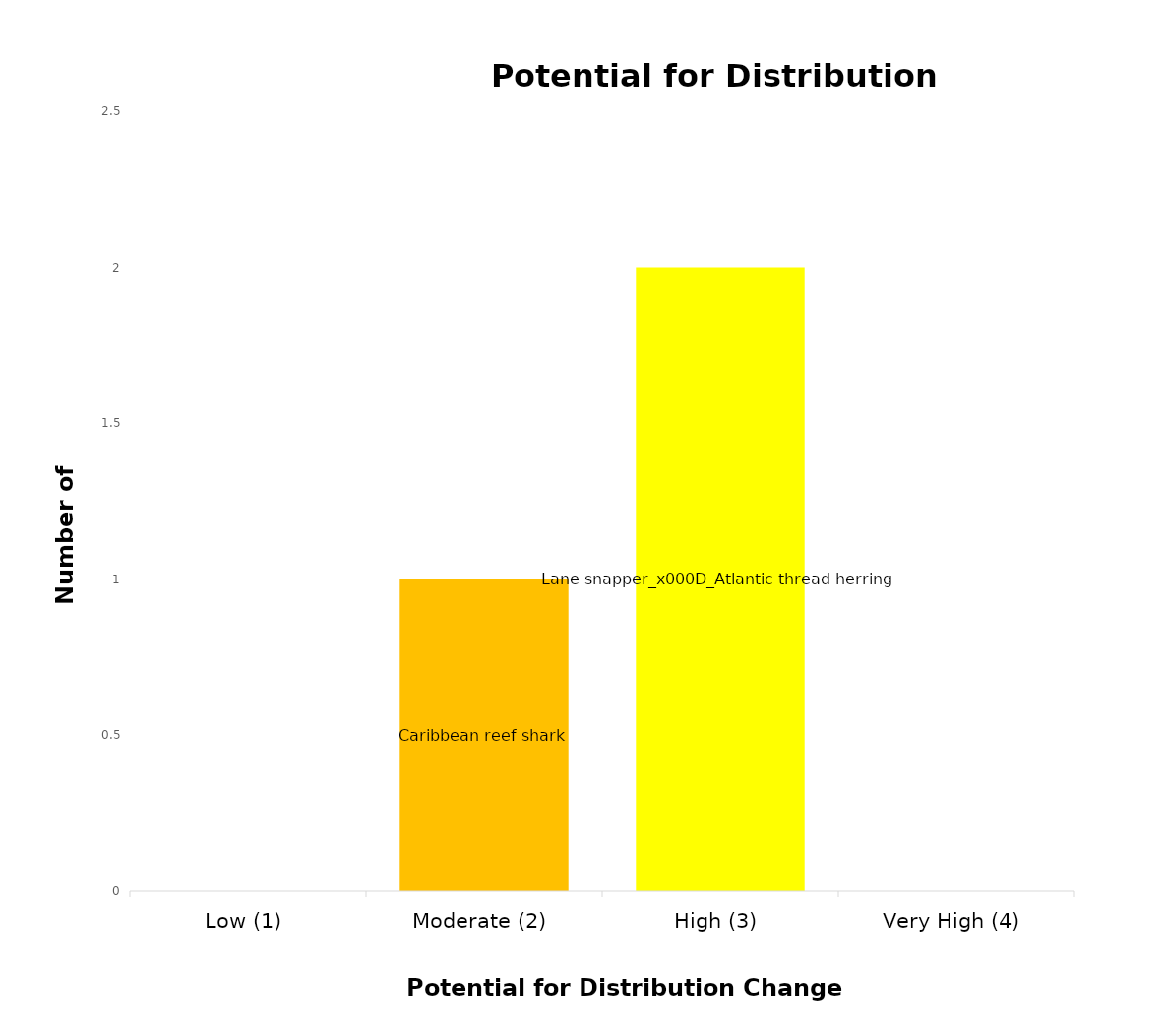
| Category | Series 0 |
|---|---|
| 0 | 0 |
| 1 | 1 |
| 2 | 2 |
| 3 | 0 |